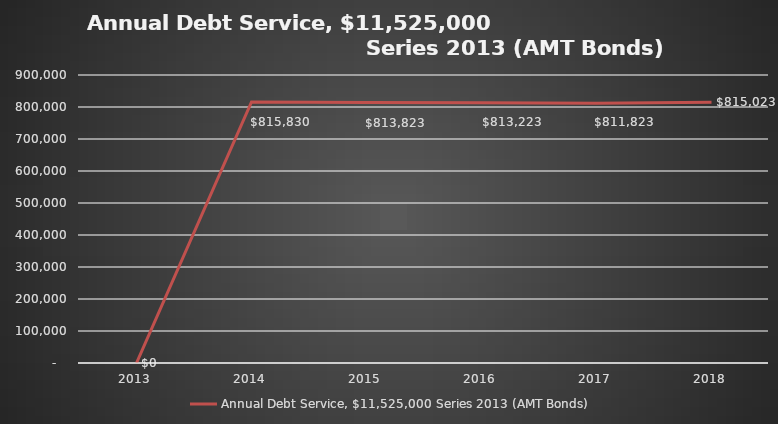
| Category | Annual Debt Service, $11,525,000 Series 2013 (AMT Bonds) |
|---|---|
| 2013.0 | 0 |
| 2014.0 | 815830 |
| 2015.0 | 813823 |
| 2016.0 | 813223 |
| 2017.0 | 811823 |
| 2018.0 | 815023 |